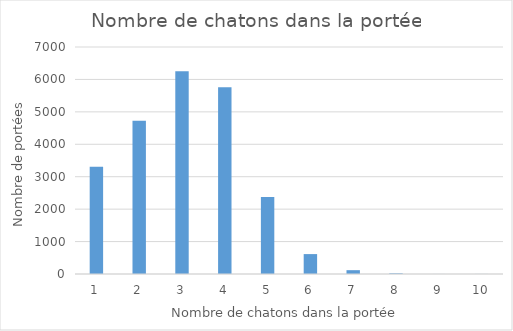
| Category | Series 0 |
|---|---|
| 1.0 | 3306 |
| 2.0 | 4726 |
| 3.0 | 6251 |
| 4.0 | 5755 |
| 5.0 | 2375 |
| 6.0 | 614 |
| 7.0 | 118 |
| 8.0 | 20 |
| 9.0 | 1 |
| 10.0 | 2 |